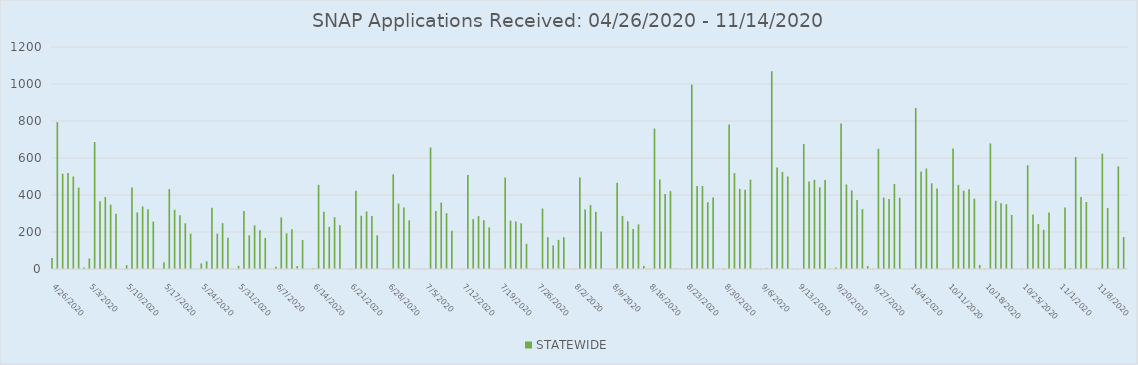
| Category | STATEWIDE |
|---|---|
| 4/26/20 | 59 |
| 4/27/20 | 794 |
| 4/28/20 | 515 |
| 4/29/20 | 519 |
| 4/30/20 | 500 |
| 5/1/20 | 440 |
| 5/2/20 | 8 |
| 5/3/20 | 57 |
| 5/4/20 | 686 |
| 5/5/20 | 366 |
| 5/6/20 | 389 |
| 5/7/20 | 348 |
| 5/8/20 | 298 |
| 5/10/20 | 21 |
| 5/11/20 | 440 |
| 5/12/20 | 306 |
| 5/13/20 | 338 |
| 5/14/20 | 323 |
| 5/15/20 | 256 |
| 5/17/20 | 36 |
| 5/18/20 | 432 |
| 5/19/20 | 320 |
| 5/20/20 | 291 |
| 5/21/20 | 247 |
| 5/22/20 | 191 |
| 5/24/20 | 30 |
| 5/25/20 | 42 |
| 5/26/20 | 331 |
| 5/27/20 | 191 |
| 5/28/20 | 248 |
| 5/29/20 | 169 |
| 5/31/20 | 17 |
| 6/1/20 | 314 |
| 6/2/20 | 182 |
| 6/3/20 | 236 |
| 6/4/20 | 209 |
| 6/5/20 | 168 |
| 6/7/20 | 12 |
| 6/8/20 | 279 |
| 6/9/20 | 193 |
| 6/10/20 | 215 |
| 6/11/20 | 16 |
| 6/12/20 | 157 |
| 6/14/20 | 4 |
| 6/15/20 | 455 |
| 6/16/20 | 309 |
| 6/17/20 | 228 |
| 6/18/20 | 280 |
| 6/19/20 | 236 |
| 6/21/20 | 2 |
| 6/22/20 | 423 |
| 6/23/20 | 288 |
| 6/24/20 | 311 |
| 6/25/20 | 287 |
| 6/26/20 | 182 |
| 6/28/20 | 1 |
| 6/29/20 | 512 |
| 6/30/20 | 354 |
| 7/1/20 | 332 |
| 7/2/20 | 263 |
| 7/6/20 | 657 |
| 7/7/20 | 313 |
| 7/8/20 | 359 |
| 7/9/20 | 302 |
| 7/10/20 | 207 |
| 7/12/20 | 1 |
| 7/13/20 | 508 |
| 7/14/20 | 270 |
| 7/15/20 | 286 |
| 7/16/20 | 264 |
| 7/17/20 | 225 |
| 7/20/20 | 495 |
| 7/21/20 | 262 |
| 7/22/20 | 257 |
| 7/23/20 | 247 |
| 7/24/20 | 136 |
| 7/27/20 | 327 |
| 7/28/20 | 172 |
| 7/29/20 | 128 |
| 7/30/20 | 158 |
| 7/31/20 | 171 |
| 8/2/20 | 1 |
| 8/3/20 | 495 |
| 8/4/20 | 322 |
| 8/5/20 | 346 |
| 8/6/20 | 309 |
| 8/7/20 | 203 |
| 8/9/20 | 1 |
| 8/10/20 | 466 |
| 8/11/20 | 287 |
| 8/12/20 | 258 |
| 8/13/20 | 216 |
| 8/14/20 | 241 |
| 8/15/20 | 17 |
| 8/16/20 | 2 |
| 8/17/20 | 759 |
| 8/18/20 | 484 |
| 8/19/20 | 405 |
| 8/20/20 | 421 |
| 8/21/20 | 3 |
| 8/22/20 | 1 |
| 8/23/20 | 1 |
| 8/24/20 | 996 |
| 8/25/20 | 448 |
| 8/26/20 | 448 |
| 8/27/20 | 361 |
| 8/28/20 | 386 |
| 8/29/20 | 2 |
| 8/30/20 | 4 |
| 8/31/20 | 781 |
| 9/1/20 | 519 |
| 9/2/20 | 433 |
| 9/3/20 | 428 |
| 9/4/20 | 483 |
| 9/5/20 | 3 |
| 9/6/20 | 1 |
| 9/7/20 | 4 |
| 9/8/20 | 1069 |
| 9/9/20 | 549 |
| 9/10/20 | 525 |
| 9/11/20 | 500 |
| 9/12/20 | 1 |
| 9/14/20 | 676 |
| 9/15/20 | 473 |
| 9/16/20 | 482 |
| 9/17/20 | 442 |
| 9/18/20 | 481 |
| 9/19/20 | 2 |
| 9/20/20 | 8 |
| 9/21/20 | 787 |
| 9/22/20 | 457 |
| 9/23/20 | 425 |
| 9/24/20 | 373 |
| 9/25/20 | 324 |
| 9/26/20 | 16 |
| 9/27/20 | 2 |
| 9/28/20 | 650 |
| 9/29/20 | 386 |
| 9/30/20 | 379 |
| 10/1/20 | 460 |
| 10/2/20 | 385 |
| 10/3/20 | 2 |
| 10/4/20 | 1 |
| 10/5/20 | 870 |
| 10/6/20 | 527 |
| 10/7/20 | 543 |
| 10/8/20 | 463 |
| 10/9/20 | 435 |
| 10/10/20 | 1 |
| 10/12/20 | 651 |
| 10/13/20 | 455 |
| 10/14/20 | 423 |
| 10/15/20 | 431 |
| 10/16/20 | 380 |
| 10/17/20 | 22 |
| 10/18/20 | 2 |
| 10/19/20 | 679 |
| 10/20/20 | 369 |
| 10/21/20 | 356 |
| 10/22/20 | 350 |
| 10/23/20 | 292 |
| 10/25/20 | 1 |
| 10/26/20 | 561 |
| 10/27/20 | 294 |
| 10/28/20 | 243 |
| 10/29/20 | 212 |
| 10/30/20 | 305 |
| 10/31/20 | 1 |
| 11/1/20 | 3 |
| 11/2/20 | 333 |
| 11/3/20 | 5 |
| 11/4/20 | 605 |
| 11/5/20 | 389 |
| 11/6/20 | 362 |
| 11/8/20 | 1 |
| 11/9/20 | 624 |
| 11/10/20 | 330 |
| 11/11/20 | 1 |
| 11/12/20 | 555 |
| 11/13/20 | 173 |